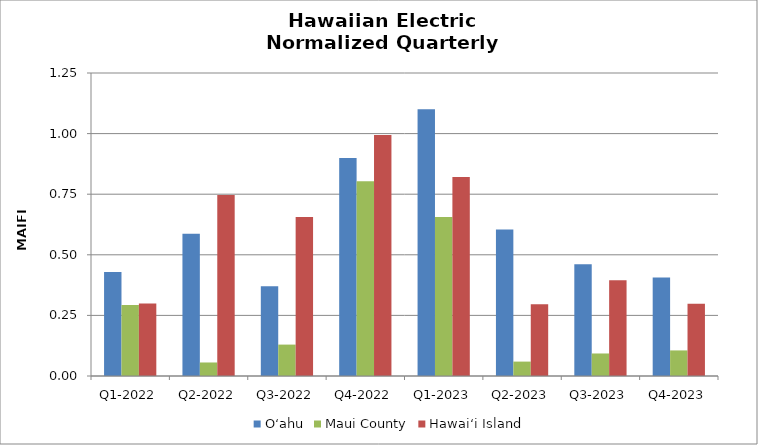
| Category | O‘ahu | Maui County | Hawai‘i Island |
|---|---|---|---|
| Q1-2022 | 0.43 | 0.293 | 0.299 |
| Q2-2022 | 0.586 | 0.056 | 0.746 |
| Q3-2022 | 0.37 | 0.13 | 0.656 |
| Q4-2022 | 0.899 | 0.804 | 0.994 |
| Q1-2023 | 1.1 | 0.656 | 0.821 |
| Q2-2023 | 0.604 | 0.059 | 0.296 |
| Q3-2023 | 0.461 | 0.093 | 0.395 |
| Q4-2023 | 0.406 | 0.106 | 0.298 |